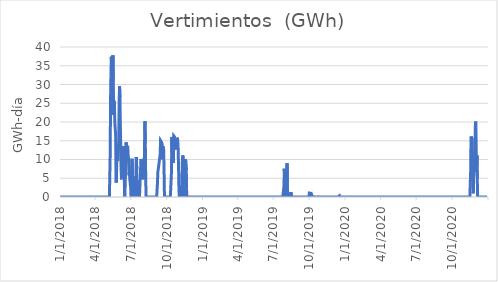
| Category | Vertimientos  (GWh) |
|---|---|
| 1/1/18 | 0 |
| 1/2/18 | 0 |
| 1/3/18 | 0 |
| 1/4/18 | 0 |
| 1/5/18 | 0 |
| 1/6/18 | 0 |
| 1/7/18 | 0 |
| 1/8/18 | 0 |
| 1/9/18 | 0 |
| 1/10/18 | 0 |
| 1/11/18 | 0 |
| 1/12/18 | 0 |
| 1/13/18 | 0 |
| 1/14/18 | 0 |
| 1/15/18 | 0 |
| 1/16/18 | 0 |
| 1/17/18 | 0 |
| 1/18/18 | 0 |
| 1/19/18 | 0 |
| 1/20/18 | 0 |
| 1/21/18 | 0 |
| 1/22/18 | 0 |
| 1/23/18 | 0 |
| 1/24/18 | 0 |
| 1/25/18 | 0 |
| 1/26/18 | 0 |
| 1/27/18 | 0 |
| 1/28/18 | 0 |
| 1/29/18 | 0 |
| 1/30/18 | 0 |
| 1/31/18 | 0 |
| 2/1/18 | 0 |
| 2/2/18 | 0 |
| 2/3/18 | 0 |
| 2/4/18 | 0 |
| 2/5/18 | 0 |
| 2/6/18 | 0 |
| 2/7/18 | 0 |
| 2/8/18 | 0 |
| 2/9/18 | 0 |
| 2/10/18 | 0 |
| 2/11/18 | 0 |
| 2/12/18 | 0 |
| 2/13/18 | 0 |
| 2/14/18 | 0 |
| 2/15/18 | 0 |
| 2/16/18 | 0 |
| 2/17/18 | 0 |
| 2/18/18 | 0 |
| 2/19/18 | 0 |
| 2/20/18 | 0 |
| 2/21/18 | 0 |
| 2/22/18 | 0 |
| 2/23/18 | 0 |
| 2/24/18 | 0 |
| 2/25/18 | 0 |
| 2/26/18 | 0 |
| 2/27/18 | 0 |
| 2/28/18 | 0 |
| 3/1/18 | 0 |
| 3/2/18 | 0 |
| 3/3/18 | 0 |
| 3/4/18 | 0 |
| 3/5/18 | 0 |
| 3/6/18 | 0 |
| 3/7/18 | 0 |
| 3/8/18 | 0 |
| 3/9/18 | 0 |
| 3/10/18 | 0 |
| 3/11/18 | 0 |
| 3/12/18 | 0 |
| 3/13/18 | 0 |
| 3/14/18 | 0 |
| 3/15/18 | 0 |
| 3/16/18 | 0 |
| 3/17/18 | 0 |
| 3/18/18 | 0 |
| 3/19/18 | 0 |
| 3/20/18 | 0 |
| 3/21/18 | 0 |
| 3/22/18 | 0 |
| 3/23/18 | 0 |
| 3/24/18 | 0 |
| 3/25/18 | 0 |
| 3/26/18 | 0 |
| 3/27/18 | 0 |
| 3/28/18 | 0 |
| 3/29/18 | 0 |
| 3/30/18 | 0 |
| 3/31/18 | 0 |
| 4/1/18 | 0 |
| 4/2/18 | 0 |
| 4/3/18 | 0 |
| 4/4/18 | 0 |
| 4/5/18 | 0 |
| 4/6/18 | 0 |
| 4/7/18 | 0 |
| 4/8/18 | 0 |
| 4/9/18 | 0 |
| 4/10/18 | 0 |
| 4/11/18 | 0 |
| 4/12/18 | 0 |
| 4/13/18 | 0 |
| 4/14/18 | 0 |
| 4/15/18 | 0 |
| 4/16/18 | 0 |
| 4/17/18 | 0 |
| 4/18/18 | 0 |
| 4/19/18 | 0 |
| 4/20/18 | 0 |
| 4/21/18 | 0 |
| 4/22/18 | 0 |
| 4/23/18 | 0 |
| 4/24/18 | 0 |
| 4/25/18 | 0 |
| 4/26/18 | 0 |
| 4/27/18 | 0 |
| 4/28/18 | 0 |
| 4/29/18 | 0 |
| 4/30/18 | 0 |
| 5/1/18 | 0 |
| 5/2/18 | 0 |
| 5/3/18 | 0 |
| 5/4/18 | 0 |
| 5/5/18 | 0 |
| 5/6/18 | 0 |
| 5/7/18 | 0 |
| 5/8/18 | 0 |
| 5/9/18 | 11.224 |
| 5/10/18 | 26.291 |
| 5/11/18 | 32.966 |
| 5/12/18 | 37.388 |
| 5/13/18 | 33.183 |
| 5/14/18 | 24.162 |
| 5/15/18 | 31.19 |
| 5/16/18 | 37.793 |
| 5/17/18 | 30.769 |
| 5/18/18 | 21.893 |
| 5/19/18 | 25.632 |
| 5/20/18 | 24.06 |
| 5/21/18 | 19.641 |
| 5/22/18 | 19.783 |
| 5/23/18 | 16.644 |
| 5/24/18 | 3.856 |
| 5/25/18 | 4.212 |
| 5/26/18 | 10.089 |
| 5/27/18 | 10.042 |
| 5/28/18 | 10.047 |
| 5/29/18 | 10.028 |
| 5/30/18 | 10.035 |
| 5/31/18 | 15.207 |
| 6/1/18 | 25.725 |
| 6/2/18 | 29.546 |
| 6/3/18 | 26.648 |
| 6/4/18 | 19.728 |
| 6/5/18 | 13.969 |
| 6/6/18 | 7.293 |
| 6/7/18 | 5.015 |
| 6/8/18 | 5.056 |
| 6/9/18 | 5.038 |
| 6/10/18 | 5.062 |
| 6/11/18 | 6.296 |
| 6/12/18 | 13.531 |
| 6/13/18 | 11.419 |
| 6/14/18 | 5.805 |
| 6/15/18 | 0 |
| 6/16/18 | 0 |
| 6/17/18 | 7.898 |
| 6/18/18 | 5.781 |
| 6/19/18 | 14.531 |
| 6/20/18 | 13.461 |
| 6/21/18 | 13.382 |
| 6/22/18 | 13.461 |
| 6/23/18 | 13.367 |
| 6/24/18 | 11.161 |
| 6/25/18 | 10.044 |
| 6/26/18 | 9.991 |
| 6/27/18 | 7.679 |
| 6/28/18 | 5.005 |
| 6/29/18 | 5.029 |
| 6/30/18 | 5.022 |
| 7/1/18 | 1.876 |
| 7/2/18 | 0 |
| 7/3/18 | 6.559 |
| 7/4/18 | 10.18 |
| 7/5/18 | 7.134 |
| 7/6/18 | 1.678 |
| 7/7/18 | 0 |
| 7/8/18 | 0.565 |
| 7/9/18 | 4.518 |
| 7/10/18 | 0 |
| 7/11/18 | 1.686 |
| 7/12/18 | 5.561 |
| 7/13/18 | 4.784 |
| 7/14/18 | 0 |
| 7/15/18 | 10.656 |
| 7/16/18 | 7.445 |
| 7/17/18 | 0 |
| 7/18/18 | 0 |
| 7/19/18 | 0 |
| 7/20/18 | 0 |
| 7/21/18 | 0 |
| 7/22/18 | 0 |
| 7/23/18 | 0 |
| 7/24/18 | 0 |
| 7/25/18 | 0 |
| 7/26/18 | 7.896 |
| 7/27/18 | 10.141 |
| 7/28/18 | 10.091 |
| 7/29/18 | 10.043 |
| 7/30/18 | 6.687 |
| 7/31/18 | 5.003 |
| 8/1/18 | 5.019 |
| 8/2/18 | 5.026 |
| 8/3/18 | 5.021 |
| 8/4/18 | 6.048 |
| 8/5/18 | 13.799 |
| 8/6/18 | 20.173 |
| 8/7/18 | 14.243 |
| 8/8/18 | 4.947 |
| 8/9/18 | 0 |
| 8/10/18 | 0 |
| 8/11/18 | 0 |
| 8/12/18 | 0 |
| 8/13/18 | 0 |
| 8/14/18 | 0 |
| 8/15/18 | 0 |
| 8/16/18 | 0 |
| 8/17/18 | 0 |
| 8/18/18 | 0 |
| 8/19/18 | 0 |
| 8/20/18 | 0 |
| 8/21/18 | 0 |
| 8/22/18 | 0 |
| 8/23/18 | 0 |
| 8/24/18 | 0 |
| 8/25/18 | 0 |
| 8/26/18 | 0 |
| 8/27/18 | 0 |
| 8/28/18 | 0 |
| 8/29/18 | 0 |
| 8/30/18 | 0 |
| 8/31/18 | 0 |
| 9/1/18 | 0 |
| 9/2/18 | 0 |
| 9/3/18 | 0 |
| 9/4/18 | 0 |
| 9/5/18 | 0 |
| 9/6/18 | 0 |
| 9/7/18 | 3.551 |
| 9/8/18 | 6.596 |
| 9/9/18 | 6.65 |
| 9/10/18 | 6.668 |
| 9/11/18 | 8.915 |
| 9/12/18 | 9.756 |
| 9/13/18 | 9.608 |
| 9/14/18 | 11.366 |
| 9/15/18 | 15.023 |
| 9/16/18 | 14.93 |
| 9/17/18 | 14.78 |
| 9/18/18 | 14.485 |
| 9/19/18 | 14.138 |
| 9/20/18 | 10.044 |
| 9/21/18 | 13.452 |
| 9/22/18 | 13.021 |
| 9/23/18 | 12.629 |
| 9/24/18 | 6.981 |
| 9/25/18 | 0 |
| 9/26/18 | 0 |
| 9/27/18 | 0 |
| 9/28/18 | 0 |
| 9/29/18 | 0 |
| 9/30/18 | 0 |
| 10/1/18 | 0 |
| 10/2/18 | 0 |
| 10/3/18 | 0 |
| 10/4/18 | 0 |
| 10/5/18 | 0 |
| 10/6/18 | 0 |
| 10/7/18 | 0 |
| 10/8/18 | 0 |
| 10/9/18 | 0 |
| 10/10/18 | 0 |
| 10/11/18 | 0 |
| 10/12/18 | 0 |
| 10/13/18 | 6.697 |
| 10/14/18 | 16.03 |
| 10/15/18 | 9.64 |
| 10/16/18 | 9.763 |
| 10/17/18 | 9.842 |
| 10/18/18 | 9.069 |
| 10/19/18 | 16.285 |
| 10/20/18 | 16.184 |
| 10/21/18 | 16.01 |
| 10/22/18 | 15.827 |
| 10/23/18 | 15.781 |
| 10/24/18 | 14.736 |
| 10/25/18 | 12.698 |
| 10/26/18 | 14.008 |
| 10/27/18 | 15.803 |
| 10/28/18 | 15.477 |
| 10/29/18 | 15.196 |
| 10/30/18 | 13.09 |
| 10/31/18 | 8.458 |
| 11/1/18 | 2.66 |
| 11/2/18 | 0 |
| 11/3/18 | 0 |
| 11/4/18 | 0 |
| 11/5/18 | 0 |
| 11/6/18 | 0 |
| 11/7/18 | 0 |
| 11/8/18 | 0 |
| 11/9/18 | 0 |
| 11/10/18 | 10.081 |
| 11/11/18 | 11.096 |
| 11/12/18 | 10.836 |
| 11/13/18 | 8.114 |
| 11/14/18 | 1.531 |
| 11/15/18 | 0 |
| 11/16/18 | 0 |
| 11/17/18 | 2.244 |
| 11/18/18 | 10.081 |
| 11/19/18 | 10.083 |
| 11/20/18 | 7.081 |
| 11/21/18 | 0 |
| 11/22/18 | 0 |
| 11/23/18 | 0 |
| 11/24/18 | 0 |
| 11/25/18 | 0 |
| 11/26/18 | 0 |
| 11/27/18 | 0 |
| 11/28/18 | 0 |
| 11/29/18 | 0 |
| 11/30/18 | 0 |
| 12/1/18 | 0 |
| 12/2/18 | 0 |
| 12/3/18 | 0 |
| 12/4/18 | 0 |
| 12/5/18 | 0 |
| 12/6/18 | 0 |
| 12/7/18 | 0 |
| 12/8/18 | 0 |
| 12/9/18 | 0 |
| 12/10/18 | 0 |
| 12/11/18 | 0 |
| 12/12/18 | 0 |
| 12/13/18 | 0 |
| 12/14/18 | 0 |
| 12/15/18 | 0 |
| 12/16/18 | 0 |
| 12/17/18 | 0 |
| 12/18/18 | 0 |
| 12/19/18 | 0 |
| 12/20/18 | 0 |
| 12/21/18 | 0 |
| 12/22/18 | 0 |
| 12/23/18 | 0 |
| 12/24/18 | 0 |
| 12/25/18 | 0 |
| 12/26/18 | 0 |
| 12/27/18 | 0 |
| 12/28/18 | 0 |
| 12/29/18 | 0 |
| 12/30/18 | 0 |
| 12/31/18 | 0 |
| 1/1/19 | 0 |
| 1/2/19 | 0 |
| 1/3/19 | 0 |
| 1/4/19 | 0 |
| 1/5/19 | 0 |
| 1/6/19 | 0 |
| 1/7/19 | 0 |
| 1/8/19 | 0 |
| 1/9/19 | 0 |
| 1/10/19 | 0 |
| 1/11/19 | 0 |
| 1/12/19 | 0 |
| 1/13/19 | 0 |
| 1/14/19 | 0 |
| 1/15/19 | 0 |
| 1/16/19 | 0 |
| 1/17/19 | 0 |
| 1/18/19 | 0 |
| 1/19/19 | 0 |
| 1/20/19 | 0 |
| 1/21/19 | 0 |
| 1/22/19 | 0 |
| 1/23/19 | 0 |
| 1/24/19 | 0 |
| 1/25/19 | 0 |
| 1/26/19 | 0 |
| 1/27/19 | 0 |
| 1/28/19 | 0 |
| 1/29/19 | 0 |
| 1/30/19 | 0 |
| 1/31/19 | 0 |
| 2/1/19 | 0 |
| 2/2/19 | 0 |
| 2/3/19 | 0 |
| 2/4/19 | 0 |
| 2/5/19 | 0 |
| 2/6/19 | 0 |
| 2/7/19 | 0 |
| 2/8/19 | 0 |
| 2/9/19 | 0 |
| 2/10/19 | 0 |
| 2/11/19 | 0 |
| 2/12/19 | 0 |
| 2/13/19 | 0 |
| 2/14/19 | 0 |
| 2/15/19 | 0 |
| 2/16/19 | 0 |
| 2/17/19 | 0 |
| 2/18/19 | 0 |
| 2/19/19 | 0 |
| 2/20/19 | 0 |
| 2/21/19 | 0 |
| 2/22/19 | 0 |
| 2/23/19 | 0 |
| 2/24/19 | 0 |
| 2/25/19 | 0 |
| 2/26/19 | 0 |
| 2/27/19 | 0 |
| 2/28/19 | 0 |
| 3/1/19 | 0 |
| 3/2/19 | 0 |
| 3/3/19 | 0 |
| 3/4/19 | 0 |
| 3/5/19 | 0 |
| 3/6/19 | 0 |
| 3/7/19 | 0 |
| 3/8/19 | 0 |
| 3/9/19 | 0 |
| 3/10/19 | 0 |
| 3/11/19 | 0 |
| 3/12/19 | 0 |
| 3/13/19 | 0 |
| 3/14/19 | 0 |
| 3/15/19 | 0 |
| 3/16/19 | 0 |
| 3/17/19 | 0 |
| 3/18/19 | 0 |
| 3/19/19 | 0 |
| 3/20/19 | 0 |
| 3/21/19 | 0 |
| 3/22/19 | 0 |
| 3/23/19 | 0 |
| 3/24/19 | 0 |
| 3/25/19 | 0 |
| 3/26/19 | 0 |
| 3/27/19 | 0 |
| 3/28/19 | 0 |
| 3/29/19 | 0 |
| 3/30/19 | 0 |
| 3/31/19 | 0 |
| 4/1/19 | 0 |
| 4/2/19 | 0 |
| 4/3/19 | 0 |
| 4/4/19 | 0 |
| 4/5/19 | 0 |
| 4/6/19 | 0 |
| 4/7/19 | 0 |
| 4/8/19 | 0 |
| 4/9/19 | 0 |
| 4/10/19 | 0 |
| 4/11/19 | 0 |
| 4/12/19 | 0 |
| 4/13/19 | 0 |
| 4/14/19 | 0 |
| 4/15/19 | 0 |
| 4/16/19 | 0 |
| 4/17/19 | 0 |
| 4/18/19 | 0 |
| 4/19/19 | 0 |
| 4/20/19 | 0 |
| 4/21/19 | 0 |
| 4/22/19 | 0 |
| 4/23/19 | 0 |
| 4/24/19 | 0 |
| 4/25/19 | 0 |
| 4/26/19 | 0 |
| 4/27/19 | 0 |
| 4/28/19 | 0 |
| 4/29/19 | 0 |
| 4/30/19 | 0 |
| 5/1/19 | 0 |
| 5/2/19 | 0 |
| 5/3/19 | 0 |
| 5/4/19 | 0 |
| 5/5/19 | 0 |
| 5/6/19 | 0 |
| 5/7/19 | 0 |
| 5/8/19 | 0 |
| 5/9/19 | 0 |
| 5/10/19 | 0 |
| 5/11/19 | 0 |
| 5/12/19 | 0 |
| 5/13/19 | 0 |
| 5/14/19 | 0 |
| 5/15/19 | 0 |
| 5/16/19 | 0 |
| 5/17/19 | 0 |
| 5/18/19 | 0 |
| 5/19/19 | 0 |
| 5/20/19 | 0 |
| 5/21/19 | 0 |
| 5/22/19 | 0 |
| 5/23/19 | 0 |
| 5/24/19 | 0 |
| 5/25/19 | 0 |
| 5/26/19 | 0 |
| 5/27/19 | 0 |
| 5/28/19 | 0 |
| 5/29/19 | 0 |
| 5/30/19 | 0 |
| 5/31/19 | 0 |
| 6/1/19 | 0 |
| 6/2/19 | 0 |
| 6/3/19 | 0 |
| 6/4/19 | 0 |
| 6/5/19 | 0 |
| 6/6/19 | 0 |
| 6/7/19 | 0 |
| 6/8/19 | 0 |
| 6/9/19 | 0 |
| 6/10/19 | 0 |
| 6/11/19 | 0 |
| 6/12/19 | 0 |
| 6/13/19 | 0 |
| 6/14/19 | 0 |
| 6/15/19 | 0 |
| 6/16/19 | 0 |
| 6/17/19 | 0 |
| 6/18/19 | 0 |
| 6/19/19 | 0 |
| 6/20/19 | 0 |
| 6/21/19 | 0 |
| 6/22/19 | 0 |
| 6/23/19 | 0 |
| 6/24/19 | 0 |
| 6/25/19 | 0 |
| 6/26/19 | 0 |
| 6/27/19 | 0 |
| 6/28/19 | 0 |
| 6/29/19 | 0 |
| 6/30/19 | 0 |
| 7/1/19 | 0 |
| 7/2/19 | 0 |
| 7/3/19 | 0 |
| 7/4/19 | 0 |
| 7/5/19 | 0 |
| 7/6/19 | 0 |
| 7/7/19 | 0 |
| 7/8/19 | 0 |
| 7/9/19 | 0 |
| 7/10/19 | 0 |
| 7/11/19 | 0 |
| 7/12/19 | 0 |
| 7/13/19 | 0 |
| 7/14/19 | 0 |
| 7/15/19 | 0 |
| 7/16/19 | 0 |
| 7/17/19 | 0 |
| 7/18/19 | 0 |
| 7/19/19 | 0 |
| 7/20/19 | 0 |
| 7/21/19 | 0 |
| 7/22/19 | 0 |
| 7/23/19 | 0 |
| 7/24/19 | 0 |
| 7/25/19 | 0 |
| 7/26/19 | 0 |
| 7/27/19 | 0 |
| 7/28/19 | 2.896 |
| 7/29/19 | 7.548 |
| 7/30/19 | 0 |
| 7/31/19 | 0 |
| 8/1/19 | 0 |
| 8/2/19 | 0 |
| 8/3/19 | 0 |
| 8/4/19 | 1.83 |
| 8/5/19 | 9.012 |
| 8/6/19 | 0 |
| 8/7/19 | 0 |
| 8/8/19 | 0 |
| 8/9/19 | 0 |
| 8/10/19 | 0 |
| 8/11/19 | 0 |
| 8/12/19 | 0 |
| 8/13/19 | 0 |
| 8/14/19 | 0.911 |
| 8/15/19 | 1.308 |
| 8/16/19 | 0 |
| 8/17/19 | 0 |
| 8/18/19 | 0 |
| 8/19/19 | 0 |
| 8/20/19 | 0 |
| 8/21/19 | 0 |
| 8/22/19 | 0 |
| 8/23/19 | 0 |
| 8/24/19 | 0 |
| 8/25/19 | 0 |
| 8/26/19 | 0 |
| 8/27/19 | 0 |
| 8/28/19 | 0 |
| 8/29/19 | 0 |
| 8/30/19 | 0 |
| 8/31/19 | 0 |
| 9/1/19 | 0 |
| 9/2/19 | 0 |
| 9/3/19 | 0 |
| 9/4/19 | 0 |
| 9/5/19 | 0 |
| 9/6/19 | 0 |
| 9/7/19 | 0 |
| 9/8/19 | 0 |
| 9/9/19 | 0 |
| 9/10/19 | 0 |
| 9/11/19 | 0 |
| 9/12/19 | 0 |
| 9/13/19 | 0 |
| 9/14/19 | 0 |
| 9/15/19 | 0 |
| 9/16/19 | 0 |
| 9/17/19 | 0 |
| 9/18/19 | 0 |
| 9/19/19 | 0 |
| 9/20/19 | 0 |
| 9/21/19 | 0 |
| 9/22/19 | 0 |
| 9/23/19 | 0 |
| 9/24/19 | 0 |
| 9/25/19 | 0 |
| 9/26/19 | 0 |
| 9/27/19 | 0 |
| 9/28/19 | 0 |
| 9/29/19 | 0 |
| 9/30/19 | 0.011 |
| 10/1/19 | 1.052 |
| 10/2/19 | 1.057 |
| 10/3/19 | 1.006 |
| 10/4/19 | 1 |
| 10/5/19 | 0.935 |
| 10/6/19 | 0.751 |
| 10/7/19 | 0 |
| 10/8/19 | 0.292 |
| 10/9/19 | 0 |
| 10/10/19 | 0 |
| 10/11/19 | 0 |
| 10/12/19 | 0 |
| 10/13/19 | 0 |
| 10/14/19 | 0 |
| 10/15/19 | 0 |
| 10/16/19 | 0 |
| 10/17/19 | 0 |
| 10/18/19 | 0 |
| 10/19/19 | 0 |
| 10/20/19 | 0 |
| 10/21/19 | 0 |
| 10/22/19 | 0 |
| 10/23/19 | 0 |
| 10/24/19 | 0.054 |
| 10/25/19 | 0.052 |
| 10/26/19 | 0 |
| 10/27/19 | 0 |
| 10/28/19 | 0 |
| 10/29/19 | 0 |
| 10/30/19 | 0 |
| 10/31/19 | 0.027 |
| 11/1/19 | 0 |
| 11/2/19 | 0 |
| 11/3/19 | 0 |
| 11/4/19 | 0 |
| 11/5/19 | 0 |
| 11/6/19 | 0 |
| 11/7/19 | 0 |
| 11/8/19 | 0 |
| 11/9/19 | 0 |
| 11/10/19 | 0 |
| 11/11/19 | 0 |
| 11/12/19 | 0 |
| 11/13/19 | 0 |
| 11/14/19 | 0 |
| 11/15/19 | 0 |
| 11/16/19 | 0 |
| 11/17/19 | 0 |
| 11/18/19 | 0 |
| 11/19/19 | 0 |
| 11/20/19 | 0 |
| 11/21/19 | 0 |
| 11/22/19 | 0 |
| 11/23/19 | 0 |
| 11/24/19 | 0 |
| 11/25/19 | 0 |
| 11/26/19 | 0 |
| 11/27/19 | 0 |
| 11/28/19 | 0 |
| 11/29/19 | 0 |
| 11/30/19 | 0 |
| 12/1/19 | 0 |
| 12/2/19 | 0 |
| 12/3/19 | 0 |
| 12/4/19 | 0 |
| 12/5/19 | 0 |
| 12/6/19 | 0 |
| 12/7/19 | 0 |
| 12/8/19 | 0 |
| 12/9/19 | 0 |
| 12/10/19 | 0 |
| 12/11/19 | 0 |
| 12/12/19 | 0 |
| 12/13/19 | 0 |
| 12/14/19 | 0 |
| 12/15/19 | 0 |
| 12/16/19 | 0 |
| 12/17/19 | 0.315 |
| 12/18/19 | 0 |
| 12/19/19 | 0 |
| 12/20/19 | 0 |
| 12/21/19 | 0 |
| 12/22/19 | 0 |
| 12/23/19 | 0 |
| 12/24/19 | 0 |
| 12/25/19 | 0 |
| 12/26/19 | 0 |
| 12/27/19 | 0 |
| 12/28/19 | 0 |
| 12/29/19 | 0 |
| 12/30/19 | 0 |
| 12/31/19 | 0 |
| 1/1/20 | 0 |
| 1/2/20 | 0 |
| 1/3/20 | 0 |
| 1/4/20 | 0 |
| 1/5/20 | 0 |
| 1/6/20 | 0 |
| 1/7/20 | 0 |
| 1/8/20 | 0 |
| 1/9/20 | 0 |
| 1/10/20 | 0 |
| 1/11/20 | 0 |
| 1/12/20 | 0 |
| 1/13/20 | 0 |
| 1/14/20 | 0 |
| 1/15/20 | 0 |
| 1/16/20 | 0 |
| 1/17/20 | 0 |
| 1/18/20 | 0 |
| 1/19/20 | 0 |
| 1/20/20 | 0 |
| 1/21/20 | 0 |
| 1/22/20 | 0 |
| 1/23/20 | 0 |
| 1/24/20 | 0 |
| 1/25/20 | 0 |
| 1/26/20 | 0 |
| 1/27/20 | 0 |
| 1/28/20 | 0 |
| 1/29/20 | 0 |
| 1/30/20 | 0 |
| 1/31/20 | 0 |
| 2/1/20 | 0 |
| 2/2/20 | 0 |
| 2/3/20 | 0 |
| 2/4/20 | 0 |
| 2/5/20 | 0 |
| 2/6/20 | 0 |
| 2/7/20 | 0 |
| 2/8/20 | 0 |
| 2/9/20 | 0 |
| 2/10/20 | 0 |
| 2/11/20 | 0 |
| 2/12/20 | 0 |
| 2/13/20 | 0 |
| 2/14/20 | 0 |
| 2/15/20 | 0 |
| 2/16/20 | 0 |
| 2/17/20 | 0 |
| 2/18/20 | 0 |
| 2/19/20 | 0 |
| 2/20/20 | 0 |
| 2/21/20 | 0 |
| 2/22/20 | 0 |
| 2/23/20 | 0 |
| 2/24/20 | 0 |
| 2/25/20 | 0 |
| 2/26/20 | 0 |
| 2/27/20 | 0 |
| 2/28/20 | 0 |
| 2/29/20 | 0 |
| 3/1/20 | 0 |
| 3/2/20 | 0 |
| 3/3/20 | 0 |
| 3/4/20 | 0 |
| 3/5/20 | 0 |
| 3/6/20 | 0 |
| 3/7/20 | 0 |
| 3/8/20 | 0 |
| 3/9/20 | 0 |
| 3/10/20 | 0 |
| 3/11/20 | 0 |
| 3/12/20 | 0 |
| 3/13/20 | 0 |
| 3/14/20 | 0 |
| 3/15/20 | 0 |
| 3/16/20 | 0 |
| 3/17/20 | 0 |
| 3/18/20 | 0 |
| 3/19/20 | 0 |
| 3/20/20 | 0 |
| 3/21/20 | 0 |
| 3/22/20 | 0 |
| 3/23/20 | 0 |
| 3/24/20 | 0 |
| 3/25/20 | 0 |
| 3/26/20 | 0 |
| 3/27/20 | 0 |
| 3/28/20 | 0 |
| 3/29/20 | 0 |
| 3/30/20 | 0 |
| 3/31/20 | 0 |
| 4/1/20 | 0 |
| 4/2/20 | 0 |
| 4/3/20 | 0 |
| 4/4/20 | 0 |
| 4/5/20 | 0 |
| 4/6/20 | 0 |
| 4/7/20 | 0 |
| 4/8/20 | 0 |
| 4/9/20 | 0 |
| 4/10/20 | 0 |
| 4/11/20 | 0 |
| 4/12/20 | 0 |
| 4/13/20 | 0 |
| 4/14/20 | 0 |
| 4/15/20 | 0 |
| 4/16/20 | 0 |
| 4/17/20 | 0 |
| 4/18/20 | 0 |
| 4/19/20 | 0 |
| 4/20/20 | 0 |
| 4/21/20 | 0 |
| 4/22/20 | 0 |
| 4/23/20 | 0 |
| 4/24/20 | 0 |
| 4/25/20 | 0 |
| 4/26/20 | 0 |
| 4/27/20 | 0 |
| 4/28/20 | 0 |
| 4/29/20 | 0 |
| 4/30/20 | 0 |
| 5/1/20 | 0 |
| 5/2/20 | 0 |
| 5/3/20 | 0 |
| 5/4/20 | 0 |
| 5/5/20 | 0 |
| 5/6/20 | 0 |
| 5/7/20 | 0 |
| 5/8/20 | 0 |
| 5/9/20 | 0 |
| 5/10/20 | 0 |
| 5/11/20 | 0 |
| 5/12/20 | 0 |
| 5/13/20 | 0 |
| 5/14/20 | 0 |
| 5/15/20 | 0 |
| 5/16/20 | 0 |
| 5/17/20 | 0 |
| 5/18/20 | 0 |
| 5/19/20 | 0 |
| 5/20/20 | 0 |
| 5/21/20 | 0 |
| 5/22/20 | 0 |
| 5/23/20 | 0 |
| 5/24/20 | 0 |
| 5/25/20 | 0 |
| 5/26/20 | 0 |
| 5/27/20 | 0 |
| 5/28/20 | 0 |
| 5/29/20 | 0 |
| 5/30/20 | 0 |
| 5/31/20 | 0 |
| 6/1/20 | 0 |
| 6/2/20 | 0 |
| 6/3/20 | 0 |
| 6/4/20 | 0 |
| 6/5/20 | 0 |
| 6/6/20 | 0 |
| 6/7/20 | 0 |
| 6/8/20 | 0 |
| 6/9/20 | 0 |
| 6/10/20 | 0 |
| 6/11/20 | 0 |
| 6/12/20 | 0 |
| 6/13/20 | 0 |
| 6/14/20 | 0 |
| 6/15/20 | 0 |
| 6/16/20 | 0 |
| 6/17/20 | 0 |
| 6/18/20 | 0 |
| 6/19/20 | 0 |
| 6/20/20 | 0 |
| 6/21/20 | 0 |
| 6/22/20 | 0 |
| 6/23/20 | 0 |
| 6/24/20 | 0 |
| 6/25/20 | 0 |
| 6/26/20 | 0 |
| 6/27/20 | 0 |
| 6/28/20 | 0 |
| 6/29/20 | 0 |
| 6/30/20 | 0 |
| 7/1/20 | 0 |
| 7/2/20 | 0 |
| 7/3/20 | 0 |
| 7/4/20 | 0 |
| 7/5/20 | 0 |
| 7/6/20 | 0 |
| 7/7/20 | 0 |
| 7/8/20 | 0 |
| 7/9/20 | 0 |
| 7/10/20 | 0 |
| 7/11/20 | 0 |
| 7/12/20 | 0 |
| 7/13/20 | 0 |
| 7/14/20 | 0 |
| 7/15/20 | 0 |
| 7/16/20 | 0 |
| 7/17/20 | 0 |
| 7/18/20 | 0 |
| 7/19/20 | 0 |
| 7/20/20 | 0 |
| 7/21/20 | 0 |
| 7/22/20 | 0 |
| 7/23/20 | 0 |
| 7/24/20 | 0 |
| 7/25/20 | 0 |
| 7/26/20 | 0 |
| 7/27/20 | 0 |
| 7/28/20 | 0 |
| 7/29/20 | 0 |
| 7/30/20 | 0 |
| 7/31/20 | 0 |
| 8/1/20 | 0 |
| 8/2/20 | 0 |
| 8/3/20 | 0 |
| 8/4/20 | 0 |
| 8/5/20 | 0 |
| 8/6/20 | 0 |
| 8/7/20 | 0 |
| 8/8/20 | 0 |
| 8/9/20 | 0 |
| 8/10/20 | 0 |
| 8/11/20 | 0 |
| 8/12/20 | 0 |
| 8/13/20 | 0 |
| 8/14/20 | 0 |
| 8/15/20 | 0 |
| 8/16/20 | 0 |
| 8/17/20 | 0 |
| 8/18/20 | 0 |
| 8/19/20 | 0 |
| 8/20/20 | 0 |
| 8/21/20 | 0 |
| 8/22/20 | 0 |
| 8/23/20 | 0 |
| 8/24/20 | 0 |
| 8/25/20 | 0 |
| 8/26/20 | 0 |
| 8/27/20 | 0 |
| 8/28/20 | 0 |
| 8/29/20 | 0 |
| 8/30/20 | 0 |
| 8/31/20 | 0 |
| 9/1/20 | 0 |
| 9/2/20 | 0 |
| 9/3/20 | 0 |
| 9/4/20 | 0 |
| 9/5/20 | 0 |
| 9/6/20 | 0 |
| 9/7/20 | 0 |
| 9/8/20 | 0 |
| 9/9/20 | 0 |
| 9/10/20 | 0 |
| 9/11/20 | 0 |
| 9/12/20 | 0 |
| 9/13/20 | 0 |
| 9/14/20 | 0 |
| 9/15/20 | 0 |
| 9/16/20 | 0 |
| 9/17/20 | 0 |
| 9/18/20 | 0 |
| 9/19/20 | 0 |
| 9/20/20 | 0 |
| 9/21/20 | 0 |
| 9/22/20 | 0 |
| 9/23/20 | 0 |
| 9/24/20 | 0 |
| 9/25/20 | 0 |
| 9/26/20 | 0 |
| 9/27/20 | 0 |
| 9/28/20 | 0 |
| 9/29/20 | 0 |
| 9/30/20 | 0 |
| 10/1/20 | 0 |
| 10/2/20 | 0 |
| 10/3/20 | 0 |
| 10/4/20 | 0 |
| 10/5/20 | 0 |
| 10/6/20 | 0 |
| 10/7/20 | 0 |
| 10/8/20 | 0 |
| 10/9/20 | 0 |
| 10/10/20 | 0 |
| 10/11/20 | 0 |
| 10/12/20 | 0 |
| 10/13/20 | 0 |
| 10/14/20 | 0 |
| 10/15/20 | 0 |
| 10/16/20 | 0 |
| 10/17/20 | 0 |
| 10/18/20 | 0 |
| 10/19/20 | 0 |
| 10/20/20 | 0 |
| 10/21/20 | 0 |
| 10/22/20 | 0 |
| 10/23/20 | 0 |
| 10/24/20 | 0 |
| 10/25/20 | 0 |
| 10/26/20 | 0 |
| 10/27/20 | 0 |
| 10/28/20 | 0 |
| 10/29/20 | 0 |
| 10/30/20 | 0 |
| 10/31/20 | 0 |
| 11/1/20 | 0 |
| 11/2/20 | 0 |
| 11/3/20 | 0 |
| 11/4/20 | 0 |
| 11/5/20 | 0 |
| 11/6/20 | 0 |
| 11/7/20 | 0 |
| 11/8/20 | 0 |
| 11/9/20 | 0 |
| 11/10/20 | 0 |
| 11/11/20 | 0 |
| 11/12/20 | 0 |
| 11/13/20 | 0 |
| 11/14/20 | 0 |
| 11/15/20 | 0 |
| 11/16/20 | 0 |
| 11/17/20 | 6.537 |
| 11/18/20 | 16.135 |
| 11/19/20 | 16.166 |
| 11/20/20 | 16.154 |
| 11/21/20 | 15.41 |
| 11/22/20 | 9.135 |
| 11/23/20 | 2.202 |
| 11/24/20 | 0.979 |
| 11/25/20 | 7.753 |
| 11/26/20 | 7.753 |
| 11/27/20 | 6.646 |
| 11/28/20 | 10.06 |
| 11/29/20 | 18.887 |
| 11/30/20 | 20.122 |
| 12/1/20 | 8.79 |
| 12/2/20 | 6.661 |
| 12/3/20 | 11.119 |
| 12/4/20 | 5.043 |
| 12/5/20 | 0 |
| 12/6/20 | 0 |
| 12/7/20 | 0 |
| 12/8/20 | 0 |
| 12/9/20 | 0 |
| 12/10/20 | 0 |
| 12/11/20 | 0 |
| 12/12/20 | 0 |
| 12/13/20 | 0 |
| 12/14/20 | 0 |
| 12/15/20 | 0 |
| 12/16/20 | 0 |
| 12/17/20 | 0 |
| 12/18/20 | 0 |
| 12/19/20 | 0 |
| 12/20/20 | 0 |
| 12/21/20 | 0 |
| 12/22/20 | 0 |
| 12/23/20 | 0 |
| 12/24/20 | 0 |
| 12/25/20 | 0 |
| 12/26/20 | 0 |
| 12/27/20 | 0 |
| 12/28/20 | 0 |
| 12/29/20 | 0 |
| 12/30/20 | 0 |
| 12/31/20 | 0 |